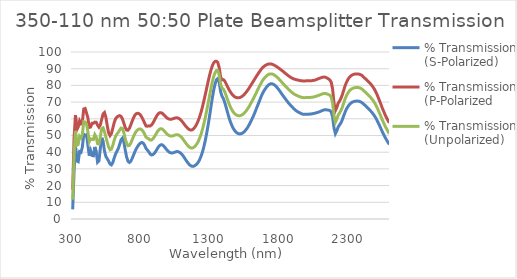
| Category | % Transmission (S-Polarized) | % Transmission (P-Polarized | % Transmission (Unpolarized) |
|---|---|---|---|
| 300.0 | 5.771 | 17.464 | 11.618 |
| 310.0 | 28.748 | 48.617 | 38.682 |
| 320.0 | 43.318 | 62.257 | 52.788 |
| 330.0 | 34.741 | 53.467 | 44.104 |
| 340.0 | 34.333 | 55.093 | 44.713 |
| 350.0 | 40.336 | 58.801 | 49.568 |
| 360.0 | 39.913 | 57.243 | 48.578 |
| 370.0 | 43.138 | 58.283 | 50.71 |
| 380.0 | 50.713 | 65.873 | 58.293 |
| 390.0 | 49.978 | 66.178 | 58.078 |
| 400.0 | 50.483 | 63.497 | 56.99 |
| 410.0 | 44.133 | 60.501 | 52.317 |
| 420.0 | 37.911 | 54.827 | 46.369 |
| 430.0 | 40.867 | 55.118 | 47.992 |
| 440.0 | 38.038 | 57.306 | 47.672 |
| 450.0 | 37.867 | 57.301 | 47.584 |
| 460.0 | 43.153 | 58.013 | 50.583 |
| 470.0 | 40.227 | 57.982 | 49.105 |
| 480.0 | 33.986 | 56.162 | 45.074 |
| 490.0 | 34.855 | 54.972 | 44.913 |
| 500.0 | 42.413 | 56.359 | 49.386 |
| 510.0 | 48.607 | 59.75 | 54.179 |
| 520.0 | 46.354 | 62.875 | 54.614 |
| 530.0 | 40.682 | 63.727 | 52.204 |
| 540.0 | 37.465 | 60.922 | 49.193 |
| 550.0 | 36.11 | 55.827 | 45.968 |
| 560.0 | 34.654 | 51.56 | 43.107 |
| 570.0 | 32.947 | 49.926 | 41.437 |
| 580.0 | 32.425 | 51.177 | 41.801 |
| 590.0 | 33.816 | 54.304 | 44.06 |
| 600.0 | 36.44 | 57.684 | 47.062 |
| 610.0 | 38.925 | 59.985 | 49.455 |
| 620.0 | 40.604 | 61.066 | 50.835 |
| 630.0 | 42.221 | 61.631 | 51.926 |
| 640.0 | 44.697 | 61.887 | 53.292 |
| 650.0 | 47.479 | 61.419 | 54.449 |
| 660.0 | 48.433 | 59.9 | 54.166 |
| 670.0 | 45.995 | 57.362 | 51.678 |
| 680.0 | 41.365 | 54.78 | 48.072 |
| 690.0 | 37.12 | 53.262 | 45.191 |
| 700.0 | 34.59 | 53.157 | 43.874 |
| 710.0 | 33.861 | 54.29 | 44.075 |
| 720.0 | 34.578 | 56.287 | 45.433 |
| 730.0 | 36.244 | 58.571 | 47.407 |
| 740.0 | 38.292 | 60.627 | 49.46 |
| 750.0 | 40.307 | 62.156 | 51.231 |
| 760.0 | 42.055 | 63.05 | 52.552 |
| 770.0 | 43.455 | 63.33 | 53.393 |
| 780.0 | 44.61 | 63.058 | 53.834 |
| 790.0 | 45.454 | 62.258 | 53.856 |
| 800.0 | 45.828 | 60.991 | 53.409 |
| 810.0 | 45.462 | 59.325 | 52.393 |
| 820.0 | 44.196 | 57.467 | 50.831 |
| 830.0 | 42.343 | 55.721 | 49.032 |
| 840.0 | 41.276 | 55.507 | 48.392 |
| 850.0 | 40.263 | 55.789 | 48.026 |
| 860.0 | 38.953 | 55.674 | 47.313 |
| 870.0 | 38.35 | 56.259 | 47.304 |
| 880.0 | 38.513 | 57.423 | 47.968 |
| 890.0 | 39.271 | 58.952 | 49.111 |
| 900.0 | 40.436 | 60.591 | 50.513 |
| 910.0 | 41.827 | 62.025 | 51.926 |
| 920.0 | 43.146 | 63.105 | 53.126 |
| 930.0 | 44.093 | 63.647 | 53.87 |
| 940.0 | 44.512 | 63.647 | 54.08 |
| 950.0 | 44.304 | 63.153 | 53.729 |
| 960.0 | 43.562 | 62.316 | 52.939 |
| 970.0 | 42.551 | 61.414 | 51.982 |
| 980.0 | 41.49 | 60.652 | 51.071 |
| 990.0 | 40.58 | 60.091 | 50.336 |
| 1000.0 | 39.938 | 59.769 | 49.854 |
| 1010.0 | 39.602 | 59.718 | 49.66 |
| 1020.0 | 39.556 | 59.884 | 49.72 |
| 1030.0 | 39.729 | 60.169 | 49.949 |
| 1040.0 | 40.052 | 60.472 | 50.262 |
| 1050.0 | 40.338 | 60.619 | 50.478 |
| 1060.0 | 40.383 | 60.505 | 50.444 |
| 1070.0 | 40.067 | 60.111 | 50.089 |
| 1080.0 | 39.508 | 59.435 | 49.471 |
| 1090.0 | 38.698 | 58.567 | 48.633 |
| 1100.0 | 37.66 | 57.487 | 47.573 |
| 1110.0 | 36.421 | 56.369 | 46.395 |
| 1120.0 | 35.156 | 55.322 | 45.239 |
| 1130.0 | 33.962 | 54.438 | 44.2 |
| 1140.0 | 32.923 | 53.735 | 43.329 |
| 1150.0 | 32.139 | 53.313 | 42.726 |
| 1160.0 | 31.64 | 53.257 | 42.449 |
| 1170.0 | 31.522 | 53.727 | 42.625 |
| 1180.0 | 31.808 | 54.568 | 43.188 |
| 1190.0 | 32.364 | 55.759 | 44.062 |
| 1200.0 | 33.105 | 57.332 | 45.219 |
| 1210.0 | 34.275 | 59.323 | 46.799 |
| 1220.0 | 35.912 | 61.71 | 48.811 |
| 1230.0 | 37.965 | 64.419 | 51.192 |
| 1240.0 | 40.535 | 67.614 | 54.075 |
| 1250.0 | 43.673 | 71.197 | 57.435 |
| 1260.0 | 47.412 | 74.885 | 61.148 |
| 1270.0 | 51.721 | 78.675 | 65.198 |
| 1280.0 | 56.467 | 82.494 | 69.481 |
| 1290.0 | 61.622 | 86.035 | 73.828 |
| 1300.0 | 67.092 | 89.177 | 78.135 |
| 1310.0 | 72.516 | 91.785 | 82.15 |
| 1320.0 | 77.277 | 93.547 | 85.412 |
| 1330.0 | 81.003 | 94.386 | 87.694 |
| 1340.0 | 83.428 | 94.426 | 88.927 |
| 1350.0 | 84.107 | 93.613 | 88.86 |
| 1360.0 | 81.642 | 90.533 | 86.087 |
| 1370.0 | 76.243 | 85.075 | 80.659 |
| 1380.0 | 73.549 | 83.326 | 78.438 |
| 1390.0 | 72.067 | 83.429 | 77.748 |
| 1400.0 | 69.688 | 82.59 | 76.139 |
| 1410.0 | 66.823 | 80.964 | 73.893 |
| 1420.0 | 63.813 | 79.192 | 71.502 |
| 1430.0 | 60.916 | 77.571 | 69.244 |
| 1440.0 | 58.35 | 76.18 | 67.265 |
| 1450.0 | 56.231 | 74.986 | 65.608 |
| 1460.0 | 54.479 | 73.982 | 64.231 |
| 1470.0 | 53.148 | 73.267 | 63.207 |
| 1480.0 | 52.155 | 72.808 | 62.481 |
| 1490.0 | 51.452 | 72.603 | 62.027 |
| 1500.0 | 51.052 | 72.588 | 61.82 |
| 1510.0 | 50.937 | 72.753 | 61.845 |
| 1520.0 | 51.123 | 73.158 | 62.14 |
| 1530.0 | 51.545 | 73.739 | 62.642 |
| 1540.0 | 52.202 | 74.51 | 63.356 |
| 1550.0 | 53.098 | 75.449 | 64.274 |
| 1560.0 | 54.185 | 76.502 | 65.343 |
| 1570.0 | 55.481 | 77.651 | 66.566 |
| 1580.0 | 57.007 | 78.926 | 67.966 |
| 1590.0 | 58.692 | 80.274 | 69.483 |
| 1600.0 | 60.411 | 81.599 | 71.005 |
| 1610.0 | 62.247 | 82.915 | 72.581 |
| 1620.0 | 64.257 | 84.278 | 74.267 |
| 1630.0 | 66.38 | 85.612 | 75.996 |
| 1640.0 | 68.478 | 86.861 | 77.669 |
| 1650.0 | 70.522 | 88.111 | 79.316 |
| 1660.0 | 72.683 | 89.239 | 80.961 |
| 1670.0 | 74.656 | 90.318 | 82.487 |
| 1680.0 | 76.261 | 91.108 | 83.685 |
| 1690.0 | 77.583 | 91.797 | 84.69 |
| 1700.0 | 78.779 | 92.273 | 85.526 |
| 1710.0 | 79.783 | 92.668 | 86.226 |
| 1720.0 | 80.536 | 92.856 | 86.696 |
| 1730.0 | 80.912 | 92.88 | 86.896 |
| 1740.0 | 81.026 | 92.738 | 86.882 |
| 1750.0 | 80.751 | 92.423 | 86.587 |
| 1760.0 | 80.227 | 91.984 | 86.106 |
| 1770.0 | 79.487 | 91.504 | 85.496 |
| 1780.0 | 78.572 | 90.976 | 84.774 |
| 1790.0 | 77.518 | 90.367 | 83.943 |
| 1800.0 | 76.366 | 89.769 | 83.068 |
| 1810.0 | 75.161 | 89.102 | 82.132 |
| 1820.0 | 73.976 | 88.513 | 81.244 |
| 1830.0 | 72.847 | 87.788 | 80.317 |
| 1840.0 | 71.783 | 87.081 | 79.432 |
| 1850.0 | 70.673 | 86.436 | 78.554 |
| 1860.0 | 69.587 | 85.794 | 77.691 |
| 1870.0 | 68.63 | 85.201 | 76.915 |
| 1880.0 | 67.743 | 84.643 | 76.193 |
| 1890.0 | 66.847 | 84.201 | 75.524 |
| 1900.0 | 65.983 | 83.83 | 74.907 |
| 1910.0 | 65.242 | 83.592 | 74.417 |
| 1920.0 | 64.634 | 83.354 | 73.994 |
| 1930.0 | 64.075 | 83.161 | 73.618 |
| 1940.0 | 63.654 | 82.963 | 73.308 |
| 1950.0 | 63.231 | 82.822 | 73.026 |
| 1960.0 | 62.839 | 82.714 | 72.777 |
| 1970.0 | 62.672 | 82.666 | 72.669 |
| 1980.0 | 62.678 | 82.678 | 72.678 |
| 1990.0 | 62.712 | 82.733 | 72.723 |
| 2000.0 | 62.754 | 82.754 | 72.754 |
| 2010.0 | 62.787 | 82.717 | 72.752 |
| 2020.0 | 62.863 | 82.736 | 72.799 |
| 2030.0 | 62.97 | 82.832 | 72.901 |
| 2040.0 | 63.151 | 82.972 | 73.062 |
| 2050.0 | 63.31 | 83.132 | 73.221 |
| 2060.0 | 63.559 | 83.388 | 73.474 |
| 2070.0 | 63.778 | 83.757 | 73.768 |
| 2080.0 | 64.056 | 84.115 | 74.086 |
| 2090.0 | 64.395 | 84.37 | 74.382 |
| 2100.0 | 64.792 | 84.726 | 74.759 |
| 2110.0 | 65.1 | 84.941 | 75.02 |
| 2120.0 | 65.365 | 84.978 | 75.171 |
| 2130.0 | 65.429 | 84.832 | 75.131 |
| 2140.0 | 65.304 | 84.388 | 74.846 |
| 2150.0 | 65.191 | 83.894 | 74.543 |
| 2160.0 | 64.967 | 83.249 | 74.108 |
| 2170.0 | 64.108 | 81.85 | 72.979 |
| 2180.0 | 61.028 | 77.735 | 69.382 |
| 2190.0 | 54.497 | 69.409 | 61.953 |
| 2200.0 | 51.097 | 64.968 | 58.033 |
| 2210.0 | 52.753 | 66.753 | 59.753 |
| 2220.0 | 55.068 | 69.308 | 62.188 |
| 2230.0 | 56.324 | 70.627 | 63.476 |
| 2240.0 | 57.547 | 72.208 | 64.878 |
| 2250.0 | 59.437 | 74.389 | 66.913 |
| 2260.0 | 61.795 | 77.064 | 69.43 |
| 2270.0 | 63.953 | 79.701 | 71.827 |
| 2280.0 | 65.82 | 81.817 | 73.819 |
| 2290.0 | 67.24 | 83.442 | 75.341 |
| 2300.0 | 68.39 | 84.754 | 76.572 |
| 2310.0 | 69.259 | 85.59 | 77.425 |
| 2320.0 | 69.849 | 86.159 | 78.004 |
| 2330.0 | 70.239 | 86.555 | 78.397 |
| 2340.0 | 70.483 | 86.761 | 78.622 |
| 2350.0 | 70.58 | 86.86 | 78.72 |
| 2360.0 | 70.608 | 86.858 | 78.733 |
| 2370.0 | 70.543 | 86.735 | 78.639 |
| 2380.0 | 70.227 | 86.5 | 78.363 |
| 2390.0 | 69.789 | 86.071 | 77.93 |
| 2400.0 | 69.133 | 85.327 | 77.23 |
| 2410.0 | 68.399 | 84.51 | 76.455 |
| 2420.0 | 67.615 | 83.777 | 75.696 |
| 2430.0 | 66.765 | 82.951 | 74.858 |
| 2440.0 | 65.949 | 82.169 | 74.059 |
| 2450.0 | 65.115 | 81.38 | 73.248 |
| 2460.0 | 64.238 | 80.378 | 72.308 |
| 2470.0 | 63.217 | 79.288 | 71.252 |
| 2480.0 | 62.101 | 78.017 | 70.059 |
| 2490.0 | 60.805 | 76.515 | 68.66 |
| 2500.0 | 59.284 | 74.761 | 67.022 |
| 2510.0 | 57.582 | 72.746 | 65.164 |
| 2520.0 | 55.849 | 70.678 | 63.263 |
| 2530.0 | 54.006 | 68.519 | 61.262 |
| 2540.0 | 52.116 | 66.232 | 59.174 |
| 2550.0 | 50.482 | 64.375 | 57.429 |
| 2560.0 | 48.813 | 62.292 | 55.553 |
| 2570.0 | 47.387 | 60.694 | 54.041 |
| 2580.0 | 45.943 | 59.051 | 52.497 |
| 2590.0 | 44.669 | 57.605 | 51.137 |